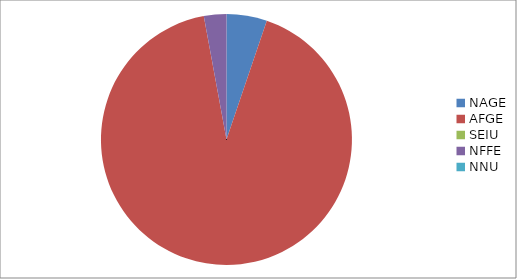
| Category | Series 0 |
|---|---|
| NAGE | 506 |
| AFGE | 8933 |
| SEIU | 0 |
| NFFE | 282 |
| NNU | 0 |